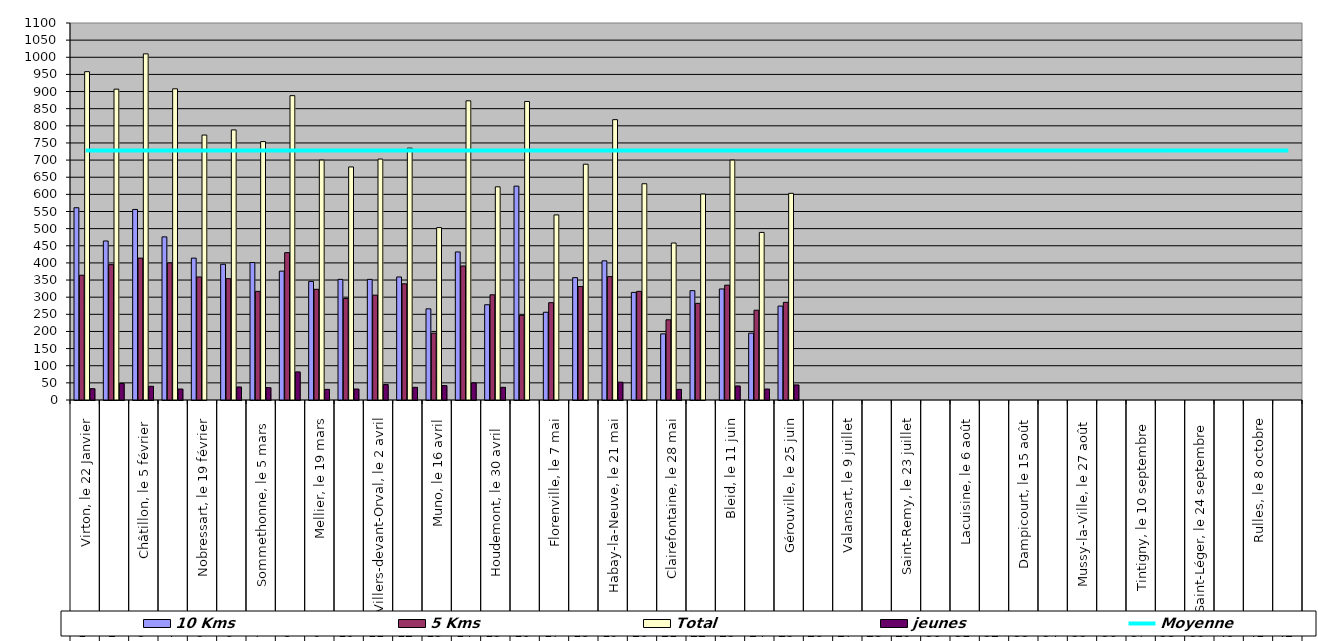
| Category | 10 Kms | 5 Kms | Total | jeunes |
|---|---|---|---|---|
| 0 | 561 | 364 | 958 | 33 |
| 1 | 464 | 395 | 907 | 48 |
| 2 | 556 | 414 | 1010 | 40 |
| 3 | 476 | 400 | 908 | 32 |
| 4 | 414 | 359 | 773 | 0 |
| 5 | 396 | 354 | 788 | 38 |
| 6 | 401 | 317 | 754 | 36 |
| 7 | 376 | 430 | 888 | 82 |
| 8 | 346 | 323 | 700 | 31 |
| 9 | 352 | 296 | 680 | 32 |
| 10 | 352 | 306 | 703 | 45 |
| 11 | 359 | 339 | 735 | 37 |
| 12 | 266 | 195 | 503 | 42 |
| 13 | 432 | 391 | 873 | 50 |
| 14 | 278 | 307 | 622 | 37 |
| 15 | 624 | 247 | 871 | 0 |
| 16 | 256 | 284 | 540 | 0 |
| 17 | 357 | 331 | 688 | 0 |
| 18 | 406 | 360 | 818 | 52 |
| 19 | 314 | 317 | 631 | 0 |
| 20 | 193 | 234 | 458 | 31 |
| 21 | 319 | 282 | 601 | 0 |
| 22 | 324 | 335 | 700 | 41 |
| 23 | 195 | 262 | 489 | 32 |
| 24 | 274 | 285 | 603 | 44 |
| 25 | 0 | 0 | 0 | 0 |
| 26 | 0 | 0 | 0 | 0 |
| 27 | 0 | 0 | 0 | 0 |
| 28 | 0 | 0 | 0 | 0 |
| 29 | 0 | 0 | 0 | 0 |
| 30 | 0 | 0 | 0 | 0 |
| 31 | 0 | 0 | 0 | 0 |
| 32 | 0 | 0 | 0 | 0 |
| 33 | 0 | 0 | 0 | 0 |
| 34 | 0 | 0 | 0 | 0 |
| 35 | 0 | 0 | 0 | 0 |
| 36 | 0 | 0 | 0 | 0 |
| 37 | 0 | 0 | 0 | 0 |
| 38 | 0 | 0 | 0 | 0 |
| 39 | 0 | 0 | 0 | 0 |
| 40 | 0 | 0 | 0 | 0 |
| 41 | 0 | 0 | 0 | 0 |